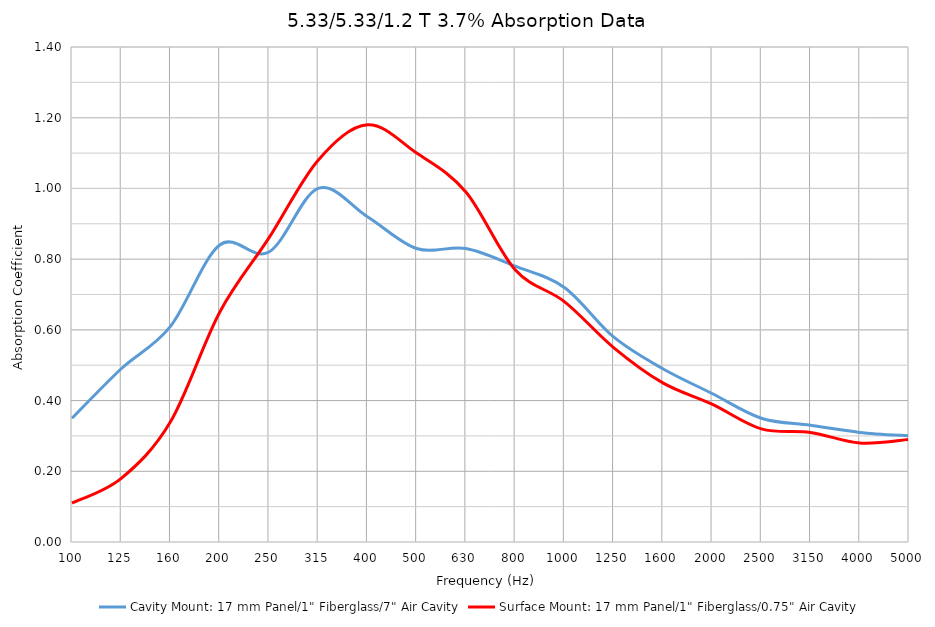
| Category | Cavity Mount: 17 mm Panel/1" Fiberglass/7" Air Cavity | Surface Mount: 17 mm Panel/1" Fiberglass/0.75" Air Cavity |
|---|---|---|
| 100.0 | 0.35 | 0.11 |
| 125.0 | 0.49 | 0.18 |
| 160.0 | 0.61 | 0.34 |
| 200.0 | 0.84 | 0.65 |
| 250.0 | 0.82 | 0.86 |
| 315.0 | 1 | 1.08 |
| 400.0 | 0.92 | 1.18 |
| 500.0 | 0.83 | 1.1 |
| 630.0 | 0.83 | 0.99 |
| 800.0 | 0.78 | 0.77 |
| 1000.0 | 0.72 | 0.68 |
| 1250.0 | 0.58 | 0.55 |
| 1600.0 | 0.49 | 0.45 |
| 2000.0 | 0.42 | 0.39 |
| 2500.0 | 0.35 | 0.32 |
| 3150.0 | 0.33 | 0.31 |
| 4000.0 | 0.31 | 0.28 |
| 5000.0 | 0.3 | 0.29 |